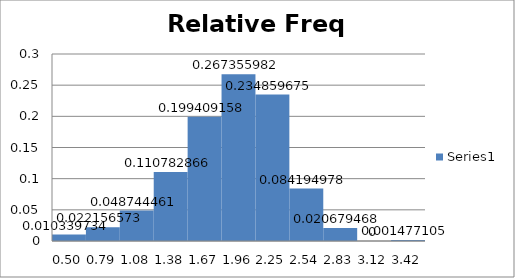
| Category | Series 0 |
|---|---|
| 0.5010805755333178 | 0.01 |
| 0.7925062599012933 | 0.022 |
| 1.0839319442692688 | 0.049 |
| 1.3753576286372442 | 0.111 |
| 1.6667833130052196 | 0.199 |
| 1.958208997373195 | 0.267 |
| 2.2496346817411705 | 0.235 |
| 2.541060366109146 | 0.084 |
| 2.8324860504771214 | 0.021 |
| 3.123911734845097 | 0 |
| 3.4153374192130728 | 0.001 |